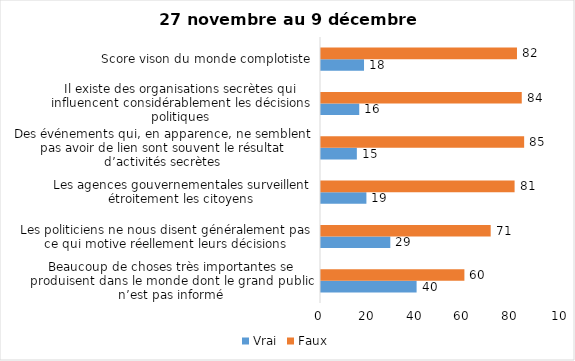
| Category | Vrai | Faux |
|---|---|---|
| Beaucoup de choses très importantes se produisent dans le monde dont le grand public n’est pas informé | 40 | 60 |
| Les politiciens ne nous disent généralement pas ce qui motive réellement leurs décisions | 29 | 71 |
| Les agences gouvernementales surveillent étroitement les citoyens | 19 | 81 |
| Des événements qui, en apparence, ne semblent pas avoir de lien sont souvent le résultat d’activités secrètes | 15 | 85 |
| Il existe des organisations secrètes qui influencent considérablement les décisions politiques | 16 | 84 |
| Score vison du monde complotiste | 18 | 82 |